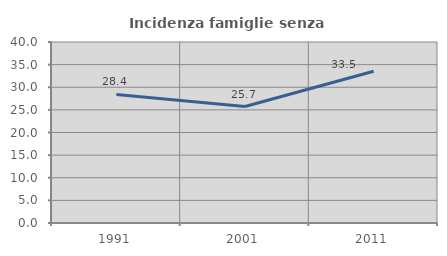
| Category | Incidenza famiglie senza nuclei |
|---|---|
| 1991.0 | 28.423 |
| 2001.0 | 25.736 |
| 2011.0 | 33.55 |